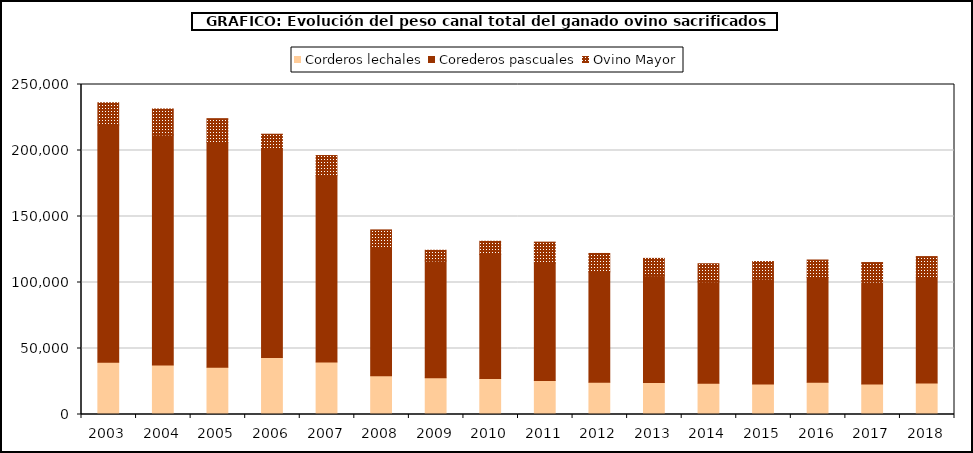
| Category | Corderos lechales | Corederos pascuales | Ovino Mayor |
|---|---|---|---|
| 2003.0 | 39573.4 | 179725.3 | 16855.9 |
| 2004.0 | 37496.969 | 174277.868 | 19688.149 |
| 2005.0 | 35754.734 | 170498.91 | 17872.177 |
| 2006.0 | 43265.425 | 158365.03 | 10706.408 |
| 2007.0 | 39690.287 | 141268.902 | 15229.867 |
| 2008.0 | 29352.285 | 97819.486 | 12681.385 |
| 2009.0 | 27925.256 | 88381.226 | 8117.939 |
| 2010.0 | 27286.013 | 93907.831 | 10041.667 |
| 2011.0 | 25698.493 | 89080.753 | 15807.735 |
| 2012.0 | 24460.359 | 83612.064 | 13930.517 |
| 2013.0 | 24211.15 | 80940.811 | 13108.832 |
| 2014.0 | 23588.116 | 77006.078 | 13625.766 |
| 2015.0 | 23076.847 | 79590.934 | 13196.397 |
| 2016.0 | 24442.917 | 79269.05 | 13341.651 |
| 2017.0 | 23138.411 | 77132.114 | 14843.253 |
| 2018.0 | 23802.289 | 80390.596 | 15449.556 |